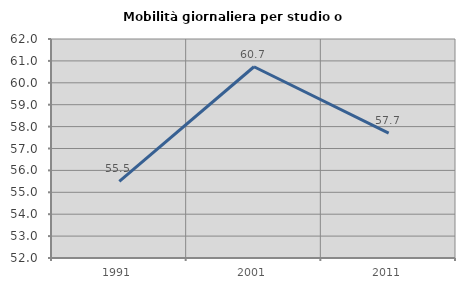
| Category | Mobilità giornaliera per studio o lavoro |
|---|---|
| 1991.0 | 55.495 |
| 2001.0 | 60.733 |
| 2011.0 | 57.702 |